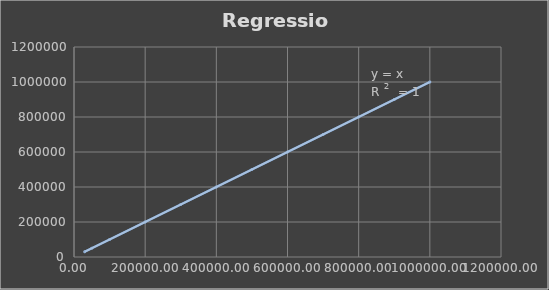
| Category | Regression |
|---|---|
| 30000.0 | 30000 |
| 50000.0 | 50000 |
| 100000.0 | 100000 |
| 200000.0 | 200000 |
| 300000.0 | 300000 |
| 400000.0 | 400000 |
| 500000.0 | 500000 |
| 600000.0 | 600000 |
| 700000.0 | 700000 |
| 800000.0 | 800000 |
| 900000.0 | 900000 |
| 1000000.0 | 1000000 |